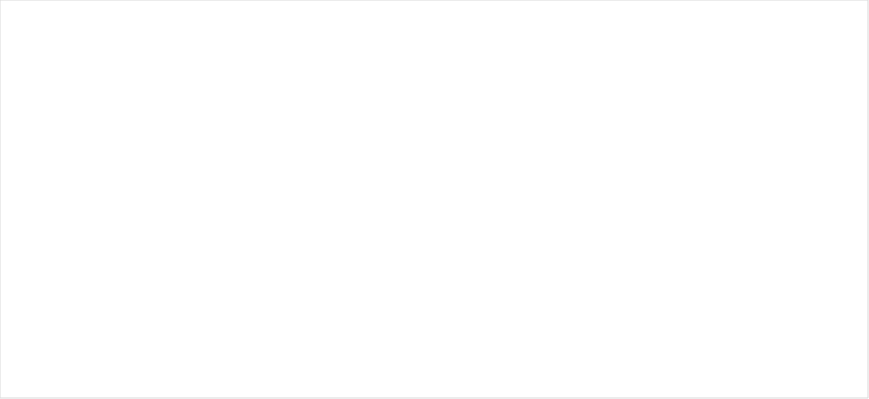
| Category | Total |
|---|---|
| 2008 | 1 |
| 2009 | 7 |
| 2010 | 3 |
| 2011 | 4 |
| 2012 | 2 |
| 2013 | 1 |
| 2014 | 3 |
| 2015 | 0 |
| 2016 | 3 |
| 2017 | 4 |